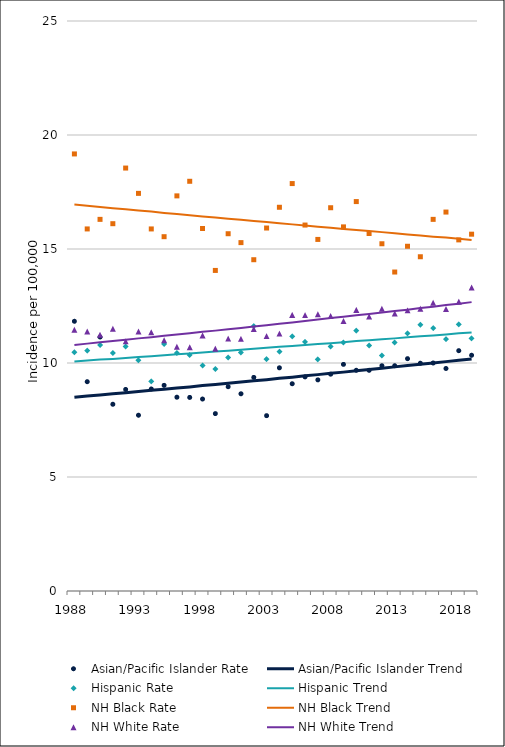
| Category | Asian/Pacific Islander Rate | Asian/Pacific Islander Trend | Hispanic Rate | Hispanic Trend | NH Black Rate | NH Black Trend | NH White Rate | NH White Trend |
|---|---|---|---|---|---|---|---|---|
| 1988.0 | 11.83 | 8.5 | 10.47 | 10.07 | 19.17 | 16.95 | 11.46 | 10.79 |
| 1989.0 | 9.18 | 8.55 | 10.54 | 10.11 | 15.88 | 16.9 | 11.38 | 10.85 |
| 1990.0 | 11.14 | 8.6 | 10.79 | 10.15 | 16.3 | 16.84 | 11.24 | 10.91 |
| 1991.0 | 8.19 | 8.65 | 10.44 | 10.18 | 16.11 | 16.79 | 11.5 | 10.96 |
| 1992.0 | 8.84 | 8.7 | 10.72 | 10.22 | 18.55 | 16.74 | 10.95 | 11.02 |
| 1993.0 | 7.71 | 8.75 | 10.12 | 10.26 | 17.44 | 16.69 | 11.38 | 11.08 |
| 1994.0 | 8.86 | 8.8 | 9.19 | 10.3 | 15.88 | 16.64 | 11.35 | 11.13 |
| 1995.0 | 9.02 | 8.85 | 10.83 | 10.34 | 15.54 | 16.58 | 11 | 11.19 |
| 1996.0 | 8.5 | 8.9 | 10.44 | 10.38 | 17.33 | 16.53 | 10.71 | 11.25 |
| 1997.0 | 8.49 | 8.95 | 10.35 | 10.42 | 17.97 | 16.48 | 10.69 | 11.31 |
| 1998.0 | 8.42 | 9.01 | 9.89 | 10.46 | 15.9 | 16.43 | 11.21 | 11.37 |
| 1999.0 | 7.78 | 9.06 | 9.74 | 10.5 | 14.06 | 16.38 | 10.63 | 11.42 |
| 2000.0 | 8.96 | 9.11 | 10.24 | 10.54 | 15.67 | 16.33 | 11.07 | 11.48 |
| 2001.0 | 8.65 | 9.17 | 10.46 | 10.58 | 15.28 | 16.28 | 11.06 | 11.54 |
| 2002.0 | 9.37 | 9.22 | 11.62 | 10.62 | 14.53 | 16.23 | 11.49 | 11.6 |
| 2003.0 | 7.69 | 9.27 | 10.17 | 10.67 | 15.92 | 16.18 | 11.18 | 11.66 |
| 2004.0 | 9.79 | 9.33 | 10.5 | 10.71 | 16.83 | 16.13 | 11.29 | 11.72 |
| 2005.0 | 9.09 | 9.38 | 11.17 | 10.75 | 17.87 | 16.08 | 12.11 | 11.78 |
| 2006.0 | 9.39 | 9.44 | 10.93 | 10.79 | 16.05 | 16.03 | 12.1 | 11.84 |
| 2007.0 | 9.26 | 9.49 | 10.16 | 10.83 | 15.42 | 15.98 | 12.14 | 11.91 |
| 2008.0 | 9.51 | 9.55 | 10.72 | 10.87 | 16.81 | 15.93 | 12.06 | 11.97 |
| 2009.0 | 9.94 | 9.6 | 10.9 | 10.91 | 15.97 | 15.88 | 11.84 | 12.03 |
| 2010.0 | 9.68 | 9.66 | 11.42 | 10.96 | 17.08 | 15.83 | 12.33 | 12.09 |
| 2011.0 | 9.68 | 9.72 | 10.77 | 11 | 15.68 | 15.79 | 12.04 | 12.15 |
| 2012.0 | 9.88 | 9.77 | 10.33 | 11.04 | 15.23 | 15.74 | 12.38 | 12.22 |
| 2013.0 | 9.88 | 9.83 | 10.9 | 11.08 | 13.99 | 15.69 | 12.17 | 12.28 |
| 2014.0 | 10.19 | 9.89 | 11.3 | 11.13 | 15.12 | 15.64 | 12.31 | 12.34 |
| 2015.0 | 9.99 | 9.94 | 11.68 | 11.17 | 14.66 | 15.59 | 12.38 | 12.41 |
| 2016.0 | 10 | 10 | 11.53 | 11.21 | 16.3 | 15.54 | 12.64 | 12.47 |
| 2017.0 | 9.76 | 10.06 | 11.05 | 11.25 | 16.62 | 15.5 | 12.37 | 12.54 |
| 2018.0 | 10.54 | 10.12 | 11.69 | 11.3 | 15.4 | 15.45 | 12.69 | 12.6 |
| 2019.0 | 10.34 | 10.18 | 11.08 | 11.34 | 15.65 | 15.4 | 13.31 | 12.67 |